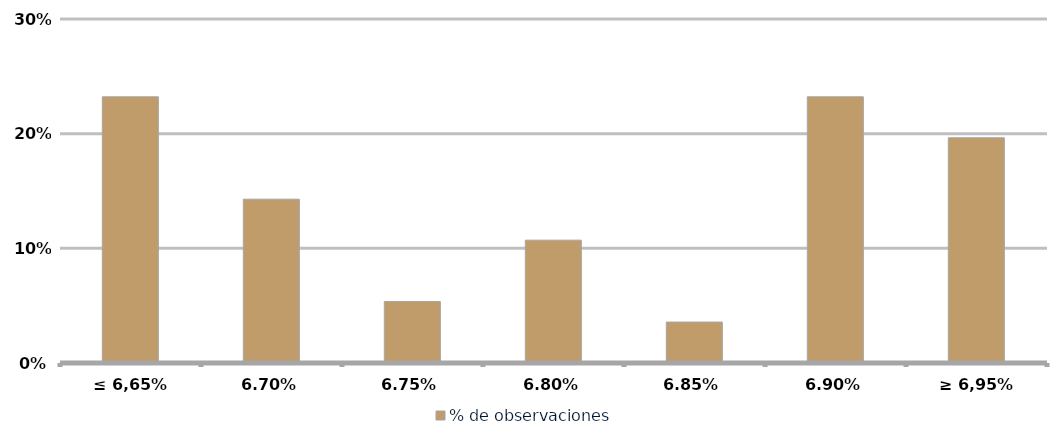
| Category | % de observaciones  |
|---|---|
| ≤ 6,65% | 0.232 |
| 6,70% | 0.143 |
| 6,75% | 0.054 |
| 6,80% | 0.107 |
| 6,85% | 0.036 |
| 6,90% | 0.232 |
| ≥ 6,95% | 0.196 |